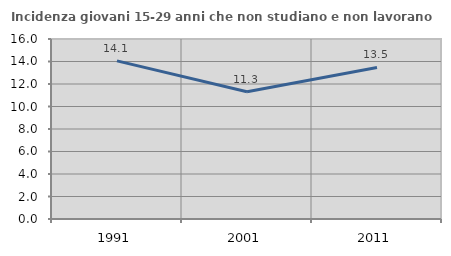
| Category | Incidenza giovani 15-29 anni che non studiano e non lavorano  |
|---|---|
| 1991.0 | 14.058 |
| 2001.0 | 11.316 |
| 2011.0 | 13.469 |